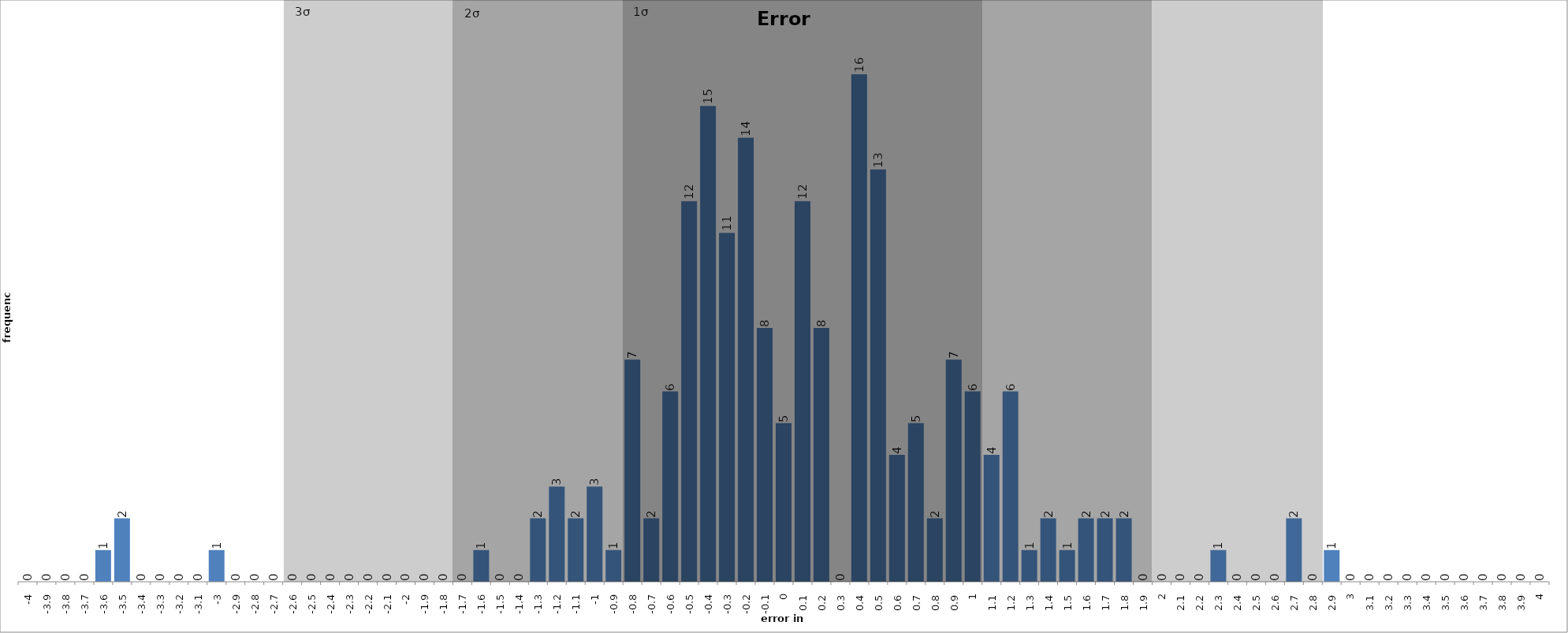
| Category | Error Frequency |
|---|---|
| -4.0 | 0 |
| -3.9 | 0 |
| -3.8 | 0 |
| -3.7 | 0 |
| -3.6 | 1 |
| -3.5 | 2 |
| -3.4 | 0 |
| -3.3 | 0 |
| -3.2 | 0 |
| -3.1 | 0 |
| -3.0 | 1 |
| -2.9 | 0 |
| -2.8 | 0 |
| -2.7 | 0 |
| -2.5999999999999996 | 0 |
| -2.5 | 0 |
| -2.4 | 0 |
| -2.3 | 0 |
| -2.2 | 0 |
| -2.0999999999999996 | 0 |
| -2.0 | 0 |
| -1.9 | 0 |
| -1.7999999999999998 | 0 |
| -1.6999999999999997 | 0 |
| -1.5999999999999996 | 1 |
| -1.5 | 0 |
| -1.4 | 0 |
| -1.2999999999999998 | 2 |
| -1.1999999999999997 | 3 |
| -1.0999999999999996 | 2 |
| -1.0 | 3 |
| -0.8999999999999999 | 1 |
| -0.7999999999999998 | 7 |
| -0.6999999999999997 | 2 |
| -0.5999999999999996 | 6 |
| -0.5 | 12 |
| -0.3999999999999999 | 15 |
| -0.2999999999999998 | 11 |
| -0.19999999999999973 | 14 |
| -0.09999999999999964 | 8 |
| 0.0 | 5 |
| 0.10000000000000053 | 12 |
| 0.20000000000000018 | 8 |
| 0.2999999999999998 | 0 |
| 0.40000000000000036 | 16 |
| 0.5 | 13 |
| 0.6000000000000005 | 4 |
| 0.7000000000000002 | 5 |
| 0.8000000000000007 | 2 |
| 0.9000000000000004 | 7 |
| 1.0 | 6 |
| 1.1000000000000005 | 4 |
| 1.2000000000000002 | 6 |
| 1.3000000000000007 | 1 |
| 1.4000000000000004 | 2 |
| 1.5 | 1 |
| 1.6000000000000005 | 2 |
| 1.7000000000000002 | 2 |
| 1.8000000000000007 | 2 |
| 1.9000000000000004 | 0 |
| 2.0 | 0 |
| 2.1000000000000005 | 0 |
| 2.2 | 0 |
| 2.3000000000000007 | 1 |
| 2.4000000000000004 | 0 |
| 2.5 | 0 |
| 2.6000000000000005 | 0 |
| 2.7 | 2 |
| 2.8000000000000007 | 0 |
| 2.9000000000000004 | 1 |
| 3.0 | 0 |
| 3.1000000000000005 | 0 |
| 3.2 | 0 |
| 3.3000000000000007 | 0 |
| 3.4000000000000004 | 0 |
| 3.5 | 0 |
| 3.6000000000000005 | 0 |
| 3.7 | 0 |
| 3.8000000000000007 | 0 |
| 3.9000000000000004 | 0 |
| 4.0 | 0 |